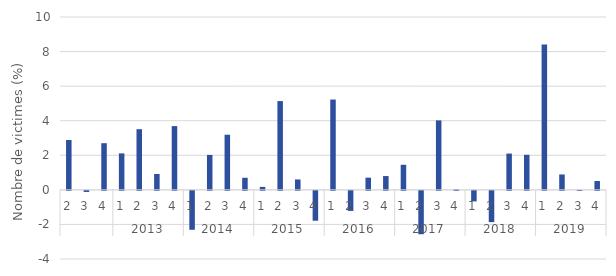
| Category | évolution trimestrielle (%) |
|---|---|
| 0 | 2.883 |
| 1 | -0.064 |
| 2 | 2.7 |
| 3 | 2.111 |
| 4 | 3.51 |
| 5 | 0.918 |
| 6 | 3.689 |
| 7 | -2.252 |
| 8 | 2.022 |
| 9 | 3.189 |
| 10 | 0.699 |
| 11 | 0.171 |
| 12 | 5.136 |
| 13 | 0.602 |
| 14 | -1.729 |
| 15 | 5.225 |
| 16 | -1.162 |
| 17 | 0.706 |
| 18 | 0.799 |
| 19 | 1.451 |
| 20 | -2.509 |
| 21 | 4.02 |
| 22 | 0.036 |
| 23 | -0.61 |
| 24 | -1.808 |
| 25 | 2.1 |
| 26 | 2.029 |
| 27 | 8.416 |
| 28 | 0.891 |
| 29 | 0 |
| 30 | 0.511 |